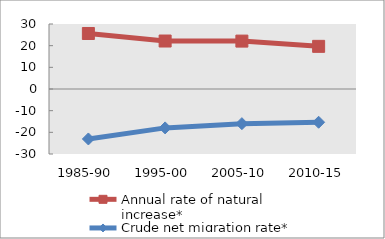
| Category | Annual rate of natural increase* | Crude net migration rate* |
|---|---|---|
| 1985-90 | 25.622 | -23.059 |
| 1995-00 | 22.146 | -17.95 |
| 2005-10 | 22.109 | -15.988 |
| 2010-15 | 19.687 | -15.352 |